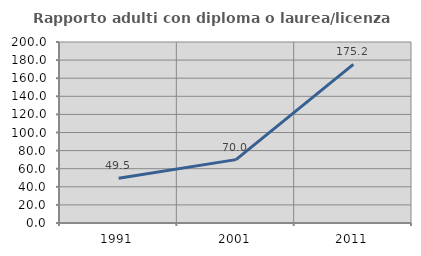
| Category | Rapporto adulti con diploma o laurea/licenza media  |
|---|---|
| 1991.0 | 49.471 |
| 2001.0 | 70.014 |
| 2011.0 | 175.213 |